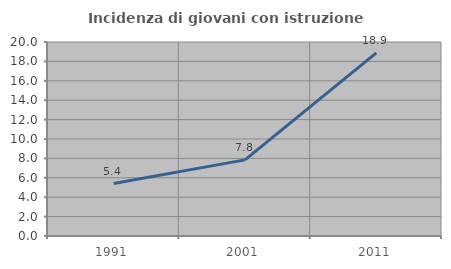
| Category | Incidenza di giovani con istruzione universitaria |
|---|---|
| 1991.0 | 5.407 |
| 2001.0 | 7.849 |
| 2011.0 | 18.883 |